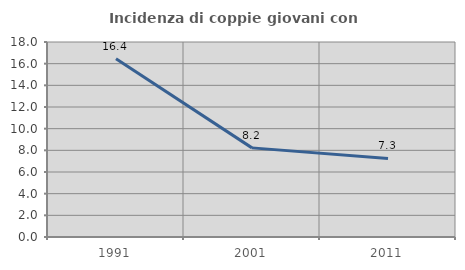
| Category | Incidenza di coppie giovani con figli |
|---|---|
| 1991.0 | 16.449 |
| 2001.0 | 8.227 |
| 2011.0 | 7.257 |